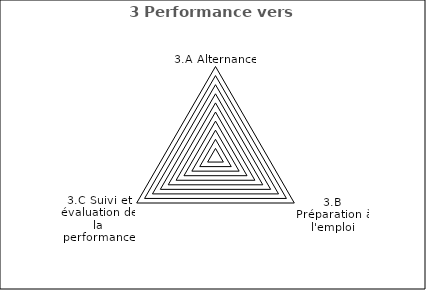
| Category | 3 Performance vers l'emploi |
|---|---|
| 3.A Alternance | 0 |
| 3.B Préparation à l'emploi | 0 |
| 3.C Suivi et évaluation de la performance | 0 |